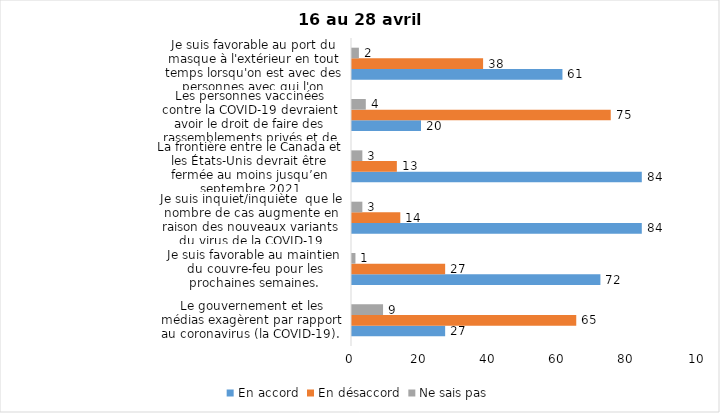
| Category | En accord | En désaccord | Ne sais pas |
|---|---|---|---|
| Le gouvernement et les médias exagèrent par rapport au coronavirus (la COVID-19). | 27 | 65 | 9 |
| Je suis favorable au maintien du couvre-feu pour les prochaines semaines. | 72 | 27 | 1 |
| Je suis inquiet/inquiète  que le nombre de cas augmente en raison des nouveaux variants du virus de la COVID-19 | 84 | 14 | 3 |
| La frontière entre le Canada et les États-Unis devrait être fermée au moins jusqu’en septembre 2021 | 84 | 13 | 3 |
| Les personnes vaccinées contre la COVID-19 devraient avoir le droit de faire des rassemblements privés et de ne plus porter le masque dans les lieux publics. | 20 | 75 | 4 |
| Je suis favorable au port du masque à l'extérieur en tout temps lorsqu'on est avec des personnes avec qui l'on n'habite pas. | 61 | 38 | 2 |